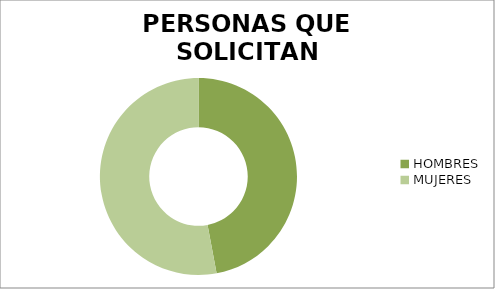
| Category | PERSONAS QUE SOLICITAN INFORMACION  |
|---|---|
| HOMBRES  | 8 |
| MUJERES | 9 |